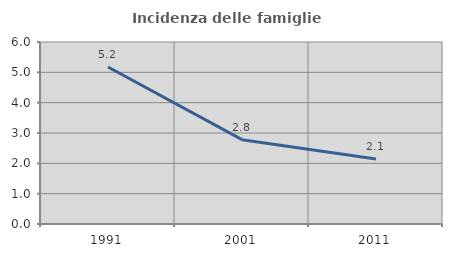
| Category | Incidenza delle famiglie numerose |
|---|---|
| 1991.0 | 5.175 |
| 2001.0 | 2.781 |
| 2011.0 | 2.145 |